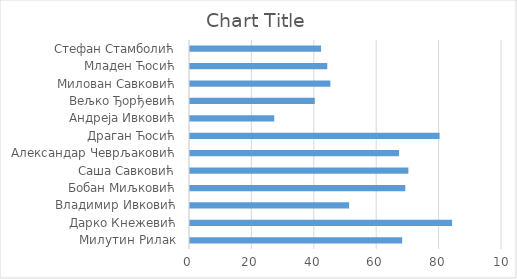
| Category | Series 0 |
|---|---|
| Милутин Рилак | 68 |
| Дарко Кнежевић | 84 |
| Владимир Ивковић | 51 |
| Бобан Миљковић | 69 |
| Саша Савковић | 70 |
| Александар Чеврљаковић | 67 |
| Драган Ћосић | 80 |
| Андреја Ивковић | 27 |
| Вељко Ђорђевић | 40 |
| Милован Савковић | 45 |
| Младен Ћосић | 44 |
| Стефан Стамболић | 42 |